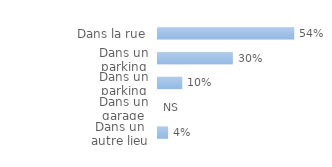
| Category | Ensemble des ménages victimes |
|---|---|
| Dans un autre lieu | 0.04 |
| Dans un garage | 0 |
| Dans un parking fermé | 0.096 |
| Dans un parking ouvert | 0.295 |
| Dans la rue | 0.538 |